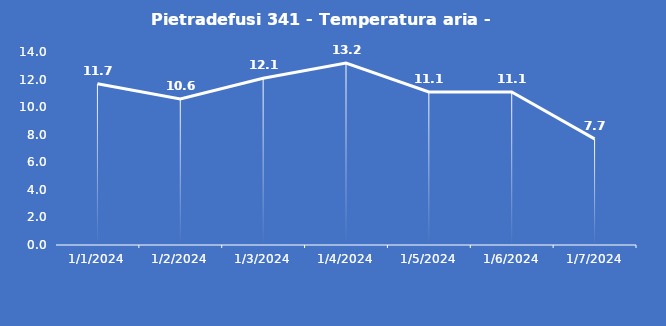
| Category | Pietradefusi 341 - Temperatura aria - Grezzo (°C) |
|---|---|
| 1/1/24 | 11.7 |
| 1/2/24 | 10.6 |
| 1/3/24 | 12.1 |
| 1/4/24 | 13.2 |
| 1/5/24 | 11.1 |
| 1/6/24 | 11.1 |
| 1/7/24 | 7.7 |